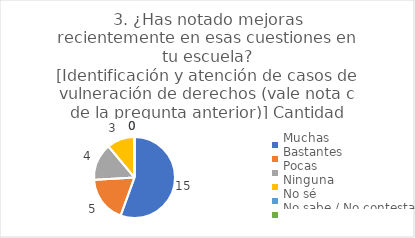
| Category | 3. ¿Has notado mejoras recientemente en esas cuestiones en tu escuela?
[Identificación y atención de casos de vulneración de derechos (vale nota c de la pregunta anterior)] |
|---|---|
| Muchas  | 0.556 |
| Bastantes  | 0.185 |
| Pocas  | 0.148 |
| Ninguna  | 0.111 |
| No sé  | 0 |
| No sabe / No contesta | 0 |